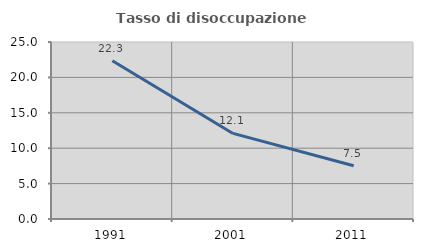
| Category | Tasso di disoccupazione giovanile  |
|---|---|
| 1991.0 | 22.346 |
| 2001.0 | 12.088 |
| 2011.0 | 7.527 |